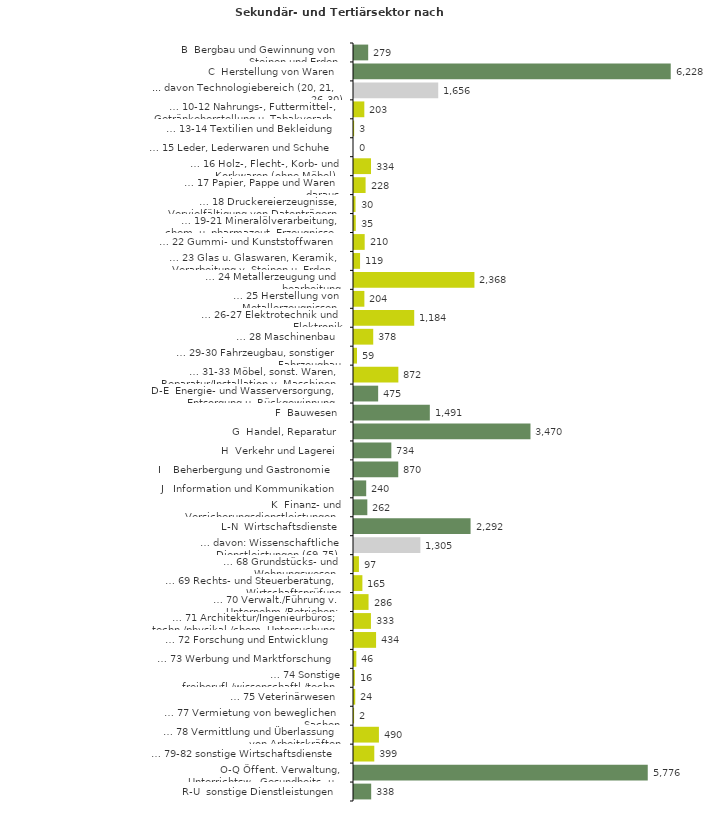
| Category | Series 0 |
|---|---|
| B  Bergbau und Gewinnung von Steinen und Erden | 279 |
| C  Herstellung von Waren | 6228 |
| ... davon Technologiebereich (20, 21, 26-30) | 1656 |
| … 10-12 Nahrungs-, Futtermittel-, Getränkeherstellung u. Tabakverarb. | 203 |
| … 13-14 Textilien und Bekleidung | 3 |
| … 15 Leder, Lederwaren und Schuhe | 0 |
| … 16 Holz-, Flecht-, Korb- und Korkwaren (ohne Möbel)  | 334 |
| … 17 Papier, Pappe und Waren daraus  | 228 |
| … 18 Druckereierzeugnisse, Vervielfältigung von Datenträgern | 30 |
| … 19-21 Mineralölverarbeitung, chem. u. pharmazeut. Erzeugnisse | 35 |
| … 22 Gummi- und Kunststoffwaren | 210 |
| … 23 Glas u. Glaswaren, Keramik, Verarbeitung v. Steinen u. Erden  | 119 |
| … 24 Metallerzeugung und -bearbeitung | 2368 |
| … 25 Herstellung von Metallerzeugnissen  | 204 |
| … 26-27 Elektrotechnik und Elektronik | 1184 |
| … 28 Maschinenbau | 378 |
| … 29-30 Fahrzeugbau, sonstiger Fahrzeugbau | 59 |
| … 31-33 Möbel, sonst. Waren, Reparatur/Installation v. Maschinen | 872 |
| D-E  Energie- und Wasserversorgung, Entsorgung u. Rückgewinnung | 475 |
| F  Bauwesen | 1491 |
| G  Handel, Reparatur | 3470 |
| H  Verkehr und Lagerei | 734 |
| I    Beherbergung und Gastronomie | 870 |
| J   Information und Kommunikation | 240 |
| K  Finanz- und Versicherungsdienstleistungen | 262 |
| L-N  Wirtschaftsdienste | 2292 |
| … davon: Wissenschaftliche Dienstleistungen (69-75) | 1305 |
| … 68 Grundstücks- und Wohnungswesen  | 97 |
| … 69 Rechts- und Steuerberatung, Wirtschaftsprüfung | 165 |
| … 70 Verwalt./Führung v. Unternehm./Betrieben; Unternehmensberat. | 286 |
| … 71 Architektur/Ingenieurbüros; techn./physikal./chem. Untersuchung | 333 |
| … 72 Forschung und Entwicklung  | 434 |
| … 73 Werbung und Marktforschung | 46 |
| … 74 Sonstige freiberufl./wissenschaftl./techn. Tätigkeiten | 16 |
| … 75 Veterinärwesen | 24 |
| … 77 Vermietung von beweglichen Sachen  | 2 |
| … 78 Vermittlung und Überlassung von Arbeitskräften | 490 |
| … 79-82 sonstige Wirtschaftsdienste | 399 |
| O-Q Öffent. Verwaltung, Unterrichtsw., Gesundheits- u. Sozialwesen | 5776 |
| R-U  sonstige Dienstleistungen | 338 |